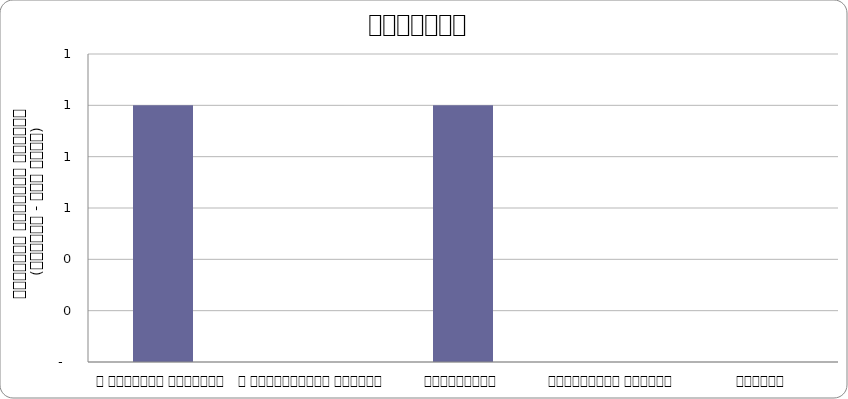
| Category | आन्दोलन |
|---|---|
| द हिमालयन टाइम्स् | 1 |
| द काठमाण्डौं पोस्ट् | 0 |
| कान्तिपुर | 1 |
| अन्नपूर्ण पोस्ट् | 0 |
| नागरिक | 0 |